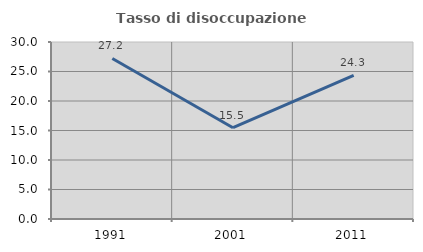
| Category | Tasso di disoccupazione giovanile  |
|---|---|
| 1991.0 | 27.206 |
| 2001.0 | 15.476 |
| 2011.0 | 24.324 |